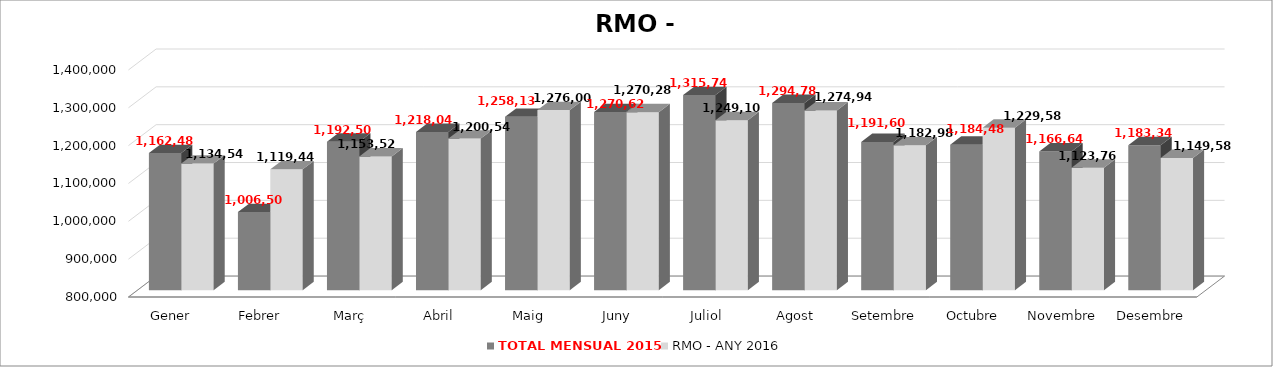
| Category | TOTAL MENSUAL 2015 | RMO - ANY 2016 |
|---|---|---|
| Gener | 1162479.99 | 1134540 |
| Febrer | 1006499.55 | 1119440 |
| Març | 1192499.99 | 1153520 |
| Abril | 1218040 | 1200540 |
| Maig | 1258138.99 | 1276000 |
| Juny | 1270620 | 1270280 |
| Juliol | 1315740 | 1249100 |
| Agost | 1294779.99 | 1274940 |
| Setembre | 1191600 | 1182980 |
| Octubre | 1184480 | 1229580 |
| Novembre | 1166640 | 1123760 |
| Desembre | 1183339.99 | 1149580 |